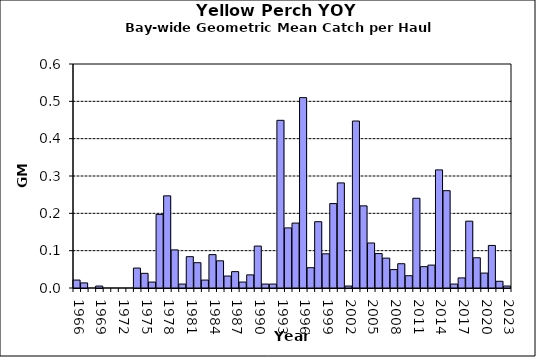
| Category | Series 0 |
|---|---|
| 1966.0 | 0.021 |
| 1967.0 | 0.014 |
| 1968.0 | 0 |
| 1969.0 | 0.005 |
| 1970.0 | 0 |
| 1971.0 | 0 |
| 1972.0 | 0 |
| 1973.0 | 0 |
| 1974.0 | 0.053 |
| 1975.0 | 0.039 |
| 1976.0 | 0.016 |
| 1977.0 | 0.197 |
| 1978.0 | 0.247 |
| 1979.0 | 0.102 |
| 1980.0 | 0.011 |
| 1981.0 | 0.084 |
| 1982.0 | 0.068 |
| 1983.0 | 0.021 |
| 1984.0 | 0.089 |
| 1985.0 | 0.073 |
| 1986.0 | 0.032 |
| 1987.0 | 0.044 |
| 1988.0 | 0.016 |
| 1989.0 | 0.035 |
| 1990.0 | 0.112 |
| 1991.0 | 0.011 |
| 1992.0 | 0.011 |
| 1993.0 | 0.449 |
| 1994.0 | 0.161 |
| 1995.0 | 0.174 |
| 1996.0 | 0.51 |
| 1997.0 | 0.054 |
| 1998.0 | 0.178 |
| 1999.0 | 0.092 |
| 2000.0 | 0.226 |
| 2001.0 | 0.281 |
| 2002.0 | 0.005 |
| 2003.0 | 0.447 |
| 2004.0 | 0.22 |
| 2005.0 | 0.121 |
| 2006.0 | 0.092 |
| 2007.0 | 0.08 |
| 2008.0 | 0.049 |
| 2009.0 | 0.065 |
| 2010.0 | 0.033 |
| 2011.0 | 0.24 |
| 2012.0 | 0.057 |
| 2013.0 | 0.061 |
| 2014.0 | 0.316 |
| 2015.0 | 0.261 |
| 2016.0 | 0.011 |
| 2017.0 | 0.027 |
| 2018.0 | 0.179 |
| 2019.0 | 0.081 |
| 2020.0 | 0.04 |
| 2021.0 | 0.114 |
| 2022.0 | 0.018 |
| 2023.0 | 0.005 |